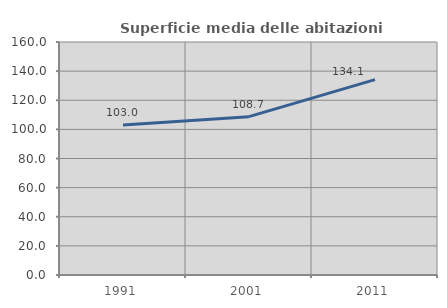
| Category | Superficie media delle abitazioni occupate |
|---|---|
| 1991.0 | 102.966 |
| 2001.0 | 108.749 |
| 2011.0 | 134.122 |